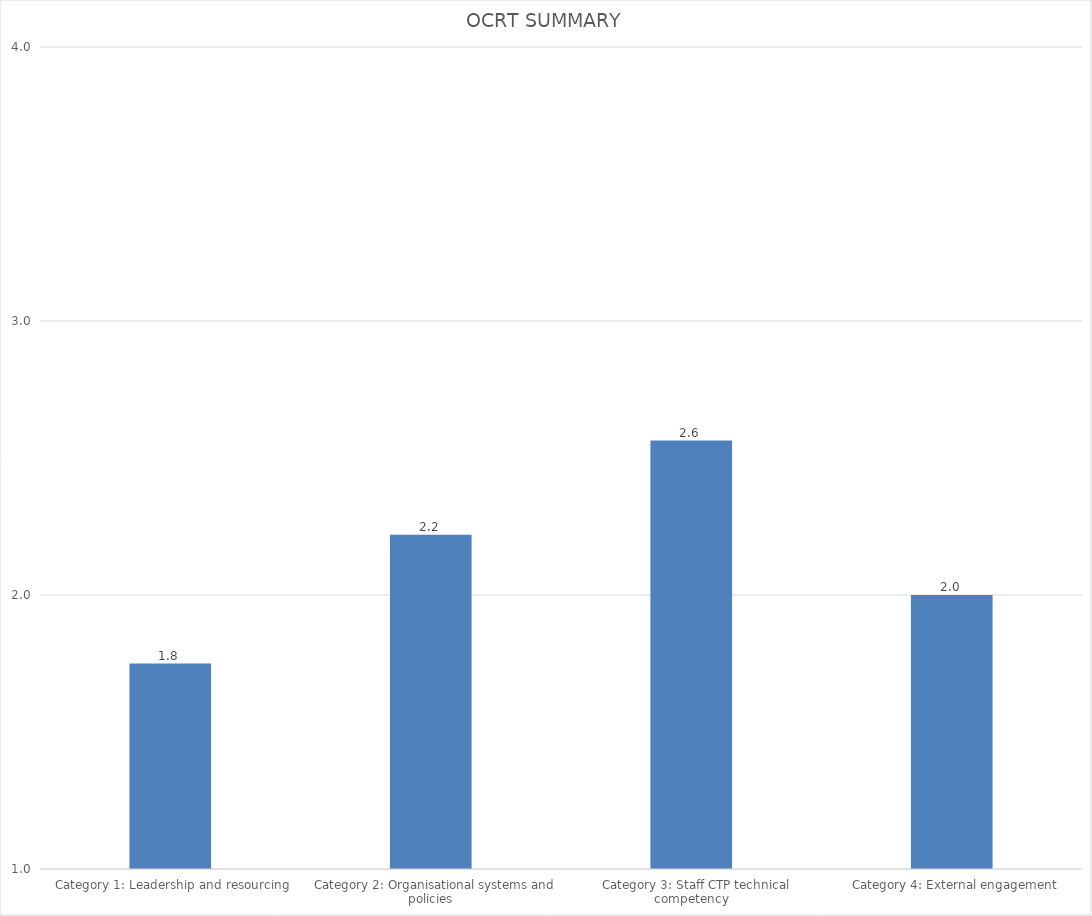
| Category | OCRT SUMMARY |
|---|---|
|   Category 1: Leadership and resourcing | 1.75 |
|   Category 2: Organisational systems and policies | 2.219 |
|   Category 3: Staff CTP technical competency | 2.563 |
|   Category 4: External engagement | 2 |